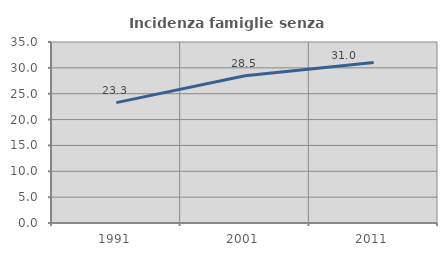
| Category | Incidenza famiglie senza nuclei |
|---|---|
| 1991.0 | 23.277 |
| 2001.0 | 28.463 |
| 2011.0 | 31.038 |